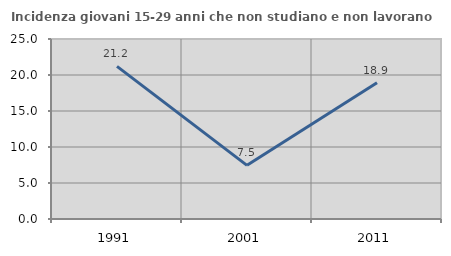
| Category | Incidenza giovani 15-29 anni che non studiano e non lavorano  |
|---|---|
| 1991.0 | 21.192 |
| 2001.0 | 7.451 |
| 2011.0 | 18.93 |